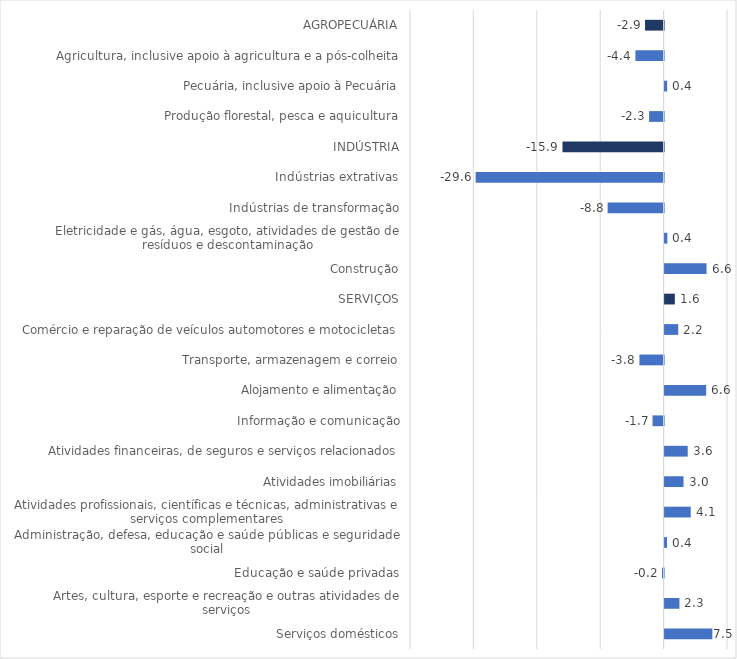
| Category | Series 0 |
|---|---|
| AGROPECUÁRIA | -2.928 |
| Agricultura, inclusive apoio à agricultura e a pós-colheita | -4.447 |
| Pecuária, inclusive apoio à Pecuária | 0.4 |
| Produção florestal, pesca e aquicultura | -2.291 |
| INDÚSTRIA | -15.95 |
| Indústrias extrativas | -29.648 |
| Indústrias de transformação | -8.829 |
| Eletricidade e gás, água, esgoto, atividades de gestão de resíduos e descontaminação | 0.429 |
| Construção | 6.616 |
| SERVIÇOS | 1.613 |
| Comércio e reparação de veículos automotores e motocicletas | 2.151 |
| Transporte, armazenagem e correio | -3.812 |
| Alojamento e alimentação | 6.552 |
| Informação e comunicação | -1.746 |
| Atividades financeiras, de seguros e serviços relacionados | 3.645 |
| Atividades imobiliárias | 2.988 |
| Atividades profissionais, científicas e técnicas, administrativas e serviços complementares | 4.121 |
| Administração, defesa, educação e saúde públicas e seguridade social | 0.378 |
| Educação e saúde privadas | -0.249 |
| Artes, cultura, esporte e recreação e outras atividades de serviços | 2.34 |
| Serviços domésticos | 7.534 |